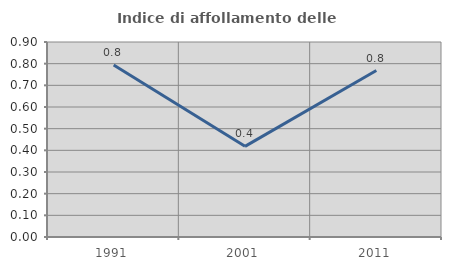
| Category | Indice di affollamento delle abitazioni  |
|---|---|
| 1991.0 | 0.794 |
| 2001.0 | 0.418 |
| 2011.0 | 0.768 |